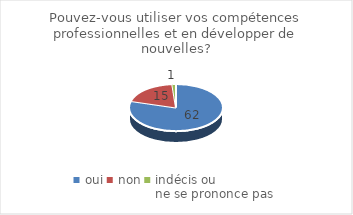
| Category | Pouvez-vous utiliser vos compétences professionnelles et en développer de nouvelles? |
|---|---|
| oui | 62 |
| non | 15 |
| indécis ou 
ne se prononce pas | 1 |